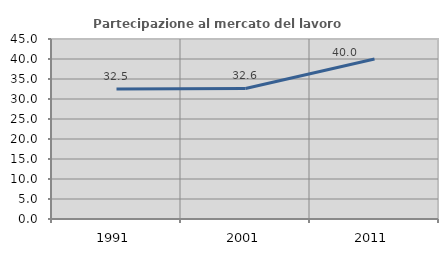
| Category | Partecipazione al mercato del lavoro  femminile |
|---|---|
| 1991.0 | 32.523 |
| 2001.0 | 32.637 |
| 2011.0 | 40 |